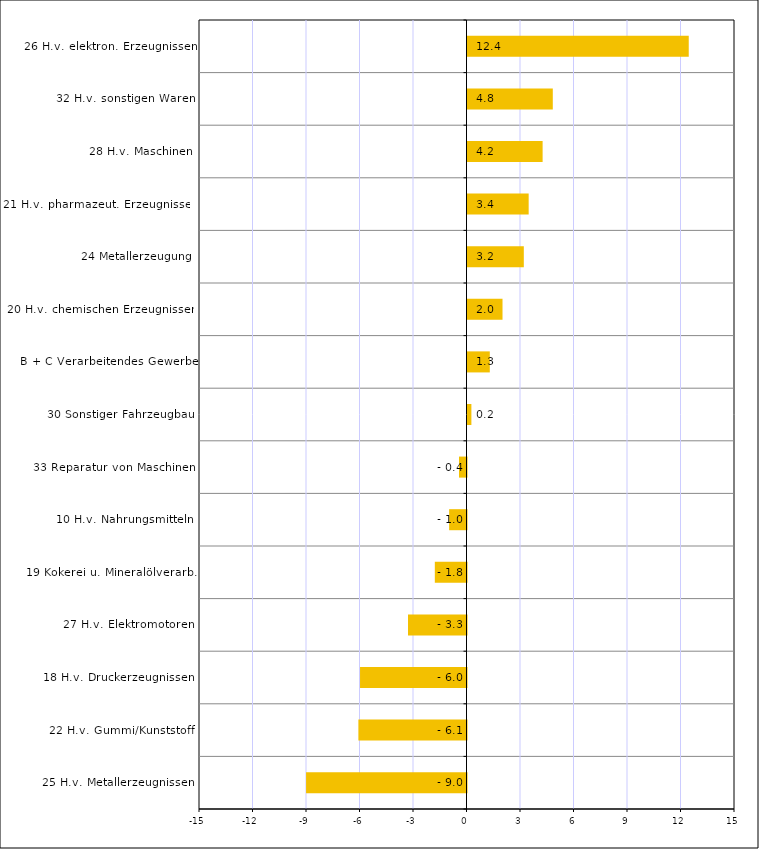
| Category | Series 0 |
|---|---|
| 25 H.v. Metallerzeugnissen | -8.996 |
| 22 H.v. Gummi/Kunststoff | -6.062 |
| 18 H.v. Druckerzeugnissen | -5.97 |
| 27 H.v. Elektromotoren | -3.28 |
| 19 Kokerei u. Mineralölverarb. | -1.776 |
| 10 H.v. Nahrungsmitteln | -0.974 |
| 33 Reparatur von Maschinen | -0.422 |
| 30 Sonstiger Fahrzeugbau | 0.218 |
| B + C Verarbeitendes Gewerbe | 1.25 |
| 20 H.v. chemischen Erzeugnissen | 1.963 |
| 24 Metallerzeugung | 3.158 |
| 21 H.v. pharmazeut. Erzeugnissen | 3.43 |
| 28 H.v. Maschinen | 4.212 |
| 32 H.v. sonstigen Waren | 4.783 |
| 26 H.v. elektron. Erzeugnissen | 12.406 |